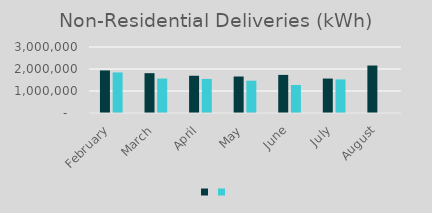
| Category | Series 1 | Series 0 |
|---|---|---|
| February | 1935461 | 1843770 |
| March | 1810164 | 1565360 |
| April | 1693101 | 1549578 |
| May | 1658799 | 1468467 |
| June | 1732026 | 1273660 |
| July | 1565715 | 1527956 |
| August | 2157982 | 0 |